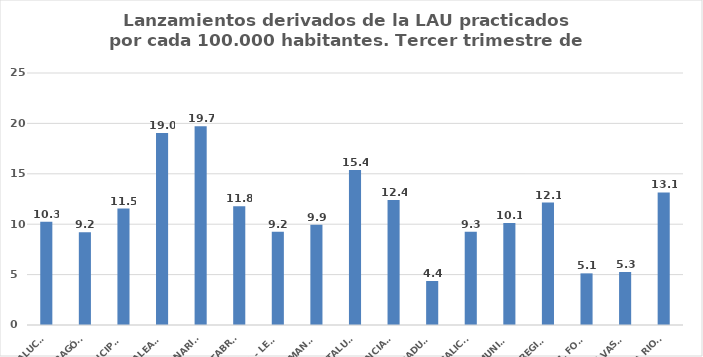
| Category | Series 0 |
|---|---|
| ANDALUCÍA | 10.252 |
| ARAGÓN | 9.205 |
| ASTURIAS, PRINCIPADO | 11.548 |
| ILLES BALEARS | 19.044 |
| CANARIAS | 19.711 |
| CANTABRIA | 11.79 |
| CASTILLA - LEÓN | 9.24 |
| CASTILLA - LA MANCHA | 9.941 |
| CATALUÑA | 15.379 |
| C. VALENCIANA | 12.395 |
| EXTREMADURA | 4.363 |
| GALICIA | 9.259 |
| MADRID, COMUNIDAD | 10.127 |
| MURCIA, REGIÓN | 12.145 |
| NAVARRA, COM. FORAL | 5.123 |
| PAÍS VASCO | 5.256 |
| LA RIOJA | 13.146 |